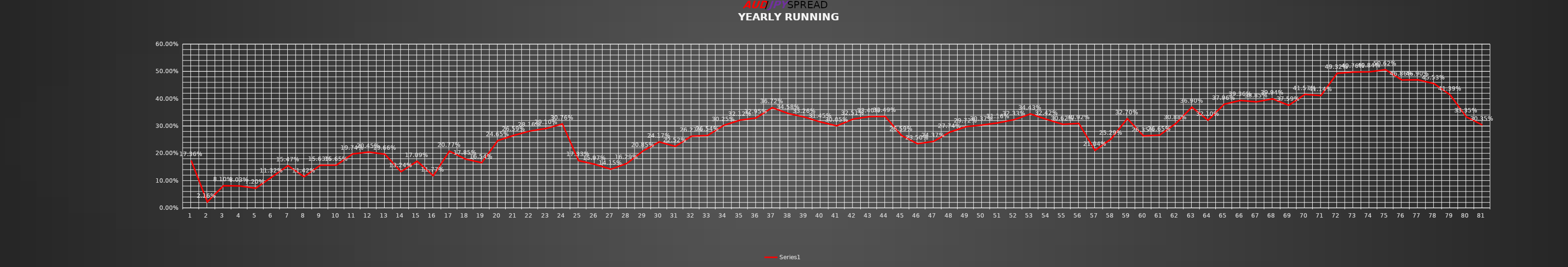
| Category | Series 1 |
|---|---|
| 0 | 0.174 |
| 1 | 0.022 |
| 2 | 0.081 |
| 3 | 0.08 |
| 4 | 0.072 |
| 5 | 0.113 |
| 6 | 0.155 |
| 7 | 0.114 |
| 8 | 0.156 |
| 9 | 0.156 |
| 10 | 0.197 |
| 11 | 0.204 |
| 12 | 0.197 |
| 13 | 0.132 |
| 14 | 0.171 |
| 15 | 0.118 |
| 16 | 0.208 |
| 17 | 0.178 |
| 18 | 0.165 |
| 19 | 0.246 |
| 20 | 0.266 |
| 21 | 0.282 |
| 22 | 0.291 |
| 23 | 0.308 |
| 24 | 0.173 |
| 25 | 0.16 |
| 26 | 0.142 |
| 27 | 0.163 |
| 28 | 0.208 |
| 29 | 0.242 |
| 30 | 0.225 |
| 31 | 0.263 |
| 32 | 0.265 |
| 33 | 0.302 |
| 34 | 0.321 |
| 35 | 0.33 |
| 36 | 0.367 |
| 37 | 0.346 |
| 38 | 0.333 |
| 39 | 0.314 |
| 40 | 0.3 |
| 41 | 0.325 |
| 42 | 0.334 |
| 43 | 0.335 |
| 44 | 0.266 |
| 45 | 0.235 |
| 46 | 0.244 |
| 47 | 0.277 |
| 48 | 0.297 |
| 49 | 0.304 |
| 50 | 0.312 |
| 51 | 0.323 |
| 52 | 0.344 |
| 53 | 0.324 |
| 54 | 0.306 |
| 55 | 0.309 |
| 56 | 0.21 |
| 57 | 0.253 |
| 58 | 0.327 |
| 59 | 0.264 |
| 60 | 0.266 |
| 61 | 0.309 |
| 62 | 0.369 |
| 63 | 0.321 |
| 64 | 0.38 |
| 65 | 0.394 |
| 66 | 0.388 |
| 67 | 0.399 |
| 68 | 0.376 |
| 69 | 0.416 |
| 70 | 0.411 |
| 71 | 0.493 |
| 72 | 0.498 |
| 73 | 0.498 |
| 74 | 0.506 |
| 75 | 0.469 |
| 76 | 0.469 |
| 77 | 0.455 |
| 78 | 0.414 |
| 79 | 0.334 |
| 80 | 0.304 |